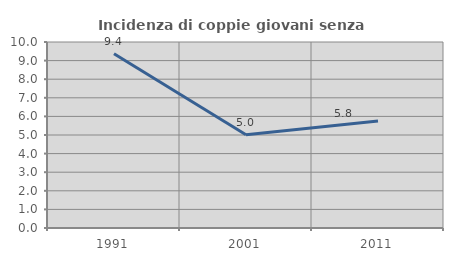
| Category | Incidenza di coppie giovani senza figli |
|---|---|
| 1991.0 | 9.363 |
| 2001.0 | 5.016 |
| 2011.0 | 5.758 |